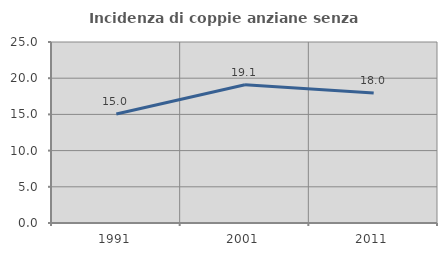
| Category | Incidenza di coppie anziane senza figli  |
|---|---|
| 1991.0 | 15.049 |
| 2001.0 | 19.106 |
| 2011.0 | 17.969 |